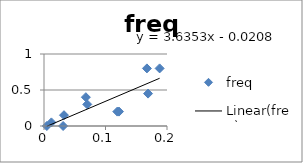
| Category | freq |
|---|---|
| 0.004593712997549236 | 0 |
| 0.012025145458985918 | 0.05 |
| 0.03250588298001393 | 0.15 |
| 0.07035331350087415 | 0.3 |
| 0.121923894456101 | 0.2 |
| 0.16919876077045914 | 0.45 |
| 0.18802827996272276 | 0.8 |
| 0.16732899931811995 | 0.8 |
| 0.11924397248677499 | 0.2 |
| 0.06804634853987812 | 0.4 |
| 0.031092350259795176 | 0 |